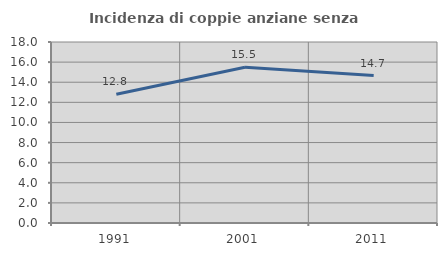
| Category | Incidenza di coppie anziane senza figli  |
|---|---|
| 1991.0 | 12.802 |
| 2001.0 | 15.486 |
| 2011.0 | 14.667 |